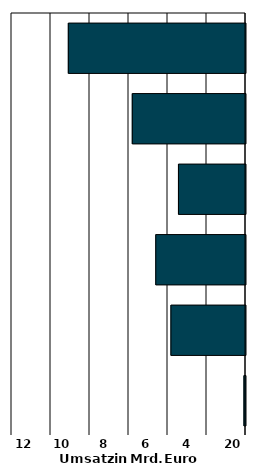
| Category | Series 0 |
|---|---|
| 0 | -0.08 |
| 1 | -3.824 |
| 2 | -4.601 |
| 3 | -3.438 |
| 4 | -5.806 |
| 5 | -9.086 |